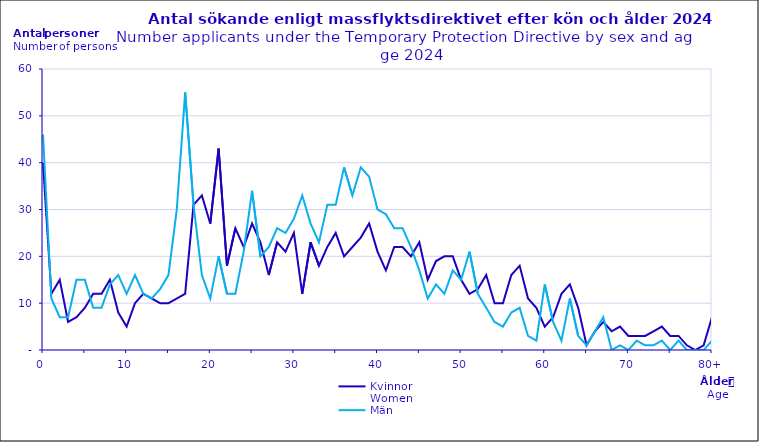
| Category | Kvinnor
Women | Män
Men |
|---|---|---|
| 0 | 40 | 46 |
| 1 | 12 | 11 |
| 2 | 15 | 7 |
| 3 | 6 | 7 |
| 4 | 7 | 15 |
| 5 | 9 | 15 |
| 6 | 12 | 9 |
| 7 | 12 | 9 |
| 8 | 15 | 14 |
| 9 | 8 | 16 |
| 10 | 5 | 12 |
| 11 | 10 | 16 |
| 12 | 12 | 12 |
| 13 | 11 | 11 |
| 14 | 10 | 13 |
| 15 | 10 | 16 |
| 16 | 11 | 30 |
| 17 | 12 | 55 |
| 18 | 31 | 31 |
| 19 | 33 | 16 |
| 20 | 27 | 11 |
| 21 | 43 | 20 |
| 22 | 18 | 12 |
| 23 | 26 | 12 |
| 24 | 22 | 21 |
| 25 | 27 | 34 |
| 26 | 23 | 20 |
| 27 | 16 | 22 |
| 28 | 23 | 26 |
| 29 | 21 | 25 |
| 30 | 25 | 28 |
| 31 | 12 | 33 |
| 32 | 23 | 27 |
| 33 | 18 | 23 |
| 34 | 22 | 31 |
| 35 | 25 | 31 |
| 36 | 20 | 39 |
| 37 | 22 | 33 |
| 38 | 24 | 39 |
| 39 | 27 | 37 |
| 40 | 21 | 30 |
| 41 | 17 | 29 |
| 42 | 22 | 26 |
| 43 | 22 | 26 |
| 44 | 20 | 22 |
| 45 | 23 | 17 |
| 46 | 15 | 11 |
| 47 | 19 | 14 |
| 48 | 20 | 12 |
| 49 | 20 | 17 |
| 50 | 15 | 15 |
| 51 | 12 | 21 |
| 52 | 13 | 12 |
| 53 | 16 | 9 |
| 54 | 10 | 6 |
| 55 | 10 | 5 |
| 56 | 16 | 8 |
| 57 | 18 | 9 |
| 58 | 11 | 3 |
| 59 | 9 | 2 |
| 60 | 5 | 14 |
| 61 | 7 | 6 |
| 62 | 12 | 2 |
| 63 | 14 | 11 |
| 64 | 9 | 3 |
| 65 | 1 | 1 |
| 66 | 4 | 4 |
| 67 | 6 | 7 |
| 68 | 4 | 0 |
| 69 | 5 | 1 |
| 70 | 3 | 0 |
| 71 | 3 | 2 |
| 72 | 3 | 1 |
| 73 | 4 | 1 |
| 74 | 5 | 2 |
| 75 | 3 | 0 |
| 76 | 3 | 2 |
| 77 | 1 | 0 |
| 78 | 0 | 0 |
| 79 | 1 | 0 |
| 80+ | 7 | 2 |